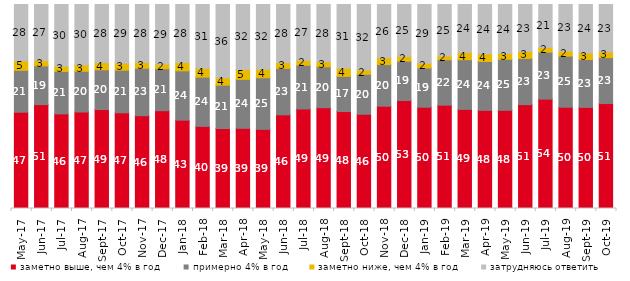
| Category | заметно выше, чем 4% в год | примерно 4% в год | заметно ниже, чем 4% в год | затрудняюсь ответить |
|---|---|---|---|---|
| 2017-05-01 | 47.2 | 20.55 | 4.55 | 27.7 |
| 2017-06-01 | 50.9 | 18.95 | 2.65 | 27.45 |
| 2017-07-01 | 46.35 | 20.8 | 2.5 | 30.3 |
| 2017-08-01 | 47.3 | 19.95 | 3.1 | 29.65 |
| 2017-09-01 | 48.5 | 19.5 | 3.55 | 28.45 |
| 2017-10-01 | 46.9 | 20.9 | 3.45 | 28.75 |
| 2017-11-01 | 45.5 | 23.25 | 2.85 | 28.4 |
| 2017-12-01 | 47.95 | 20.55 | 2.3 | 29.2 |
| 2018-01-01 | 43.3 | 24.2 | 4.05 | 28.45 |
| 2018-02-01 | 40.25 | 24.15 | 4.35 | 31.25 |
| 2018-03-01 | 39.2 | 21.25 | 3.7 | 35.85 |
| 2018-04-01 | 39.3 | 24 | 4.85 | 31.85 |
| 2018-05-01 | 38.8 | 25.3 | 4.15 | 31.75 |
| 2018-06-01 | 45.9 | 22.8 | 2.85 | 28.45 |
| 2018-07-01 | 48.8 | 21.4 | 2.45 | 27.35 |
| 2018-08-01 | 49.4 | 20.05 | 2.55 | 28 |
| 2018-09-01 | 47.5 | 17.25 | 4 | 31.2 |
| 2018-10-01 | 46.2 | 19.6 | 2.15 | 32.05 |
| 2018-11-01 | 50.15 | 20.409 | 3.244 | 26.198 |
| 2018-12-01 | 52.95 | 19.25 | 2.4 | 25.4 |
| 2019-01-01 | 49.65 | 19.25 | 2.3 | 28.8 |
| 2019-02-01 | 50.65 | 22.25 | 1.9 | 25.2 |
| 2019-03-01 | 48.583 | 24.366 | 3.531 | 23.521 |
| 2019-04-01 | 48.119 | 23.96 | 3.762 | 24.158 |
| 2019-05-01 | 48.143 | 25.012 | 2.823 | 24.022 |
| 2019-06-01 | 50.923 | 22.643 | 3.392 | 23.042 |
| 2019-07-01 | 53.614 | 23.02 | 2.327 | 21.04 |
| 2019-08-01 | 49.65 | 25.025 | 2.448 | 22.877 |
| 2019-09-01 | 49.554 | 23.465 | 3.168 | 23.812 |
| 2019-10-01 | 51.436 | 22.525 | 2.822 | 23.218 |